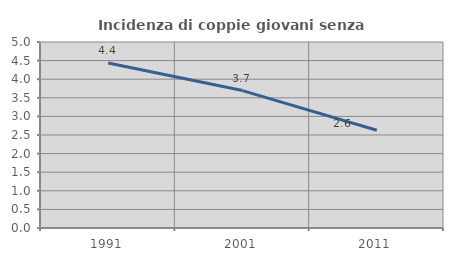
| Category | Incidenza di coppie giovani senza figli |
|---|---|
| 1991.0 | 4.437 |
| 2001.0 | 3.694 |
| 2011.0 | 2.626 |